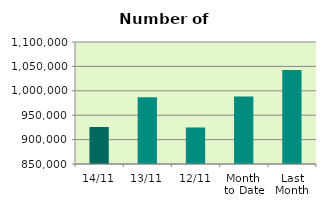
| Category | Series 0 |
|---|---|
| 14/11 | 925820 |
| 13/11 | 987036 |
| 12/11 | 924886 |
| Month 
to Date | 988220.4 |
| Last
Month | 1042648 |